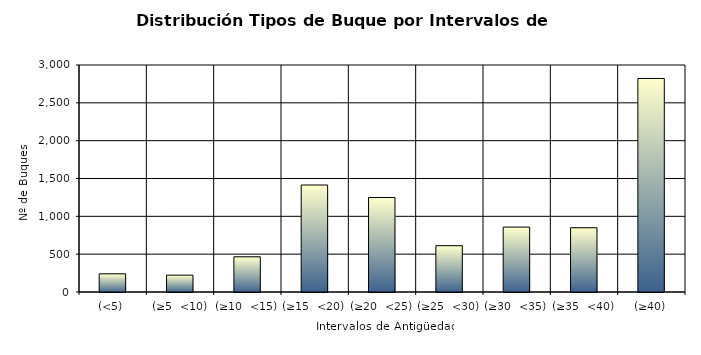
| Category | Series 0 |
|---|---|
| (<5) | 240 |
| (≥5  <10) | 223 |
| (≥10  <15) | 465 |
| (≥15  <20) | 1414 |
| (≥20  <25) | 1249 |
| (≥25  <30) | 612 |
| (≥30  <35) | 858 |
| (≥35  <40) | 849 |
| (≥40) | 2822 |